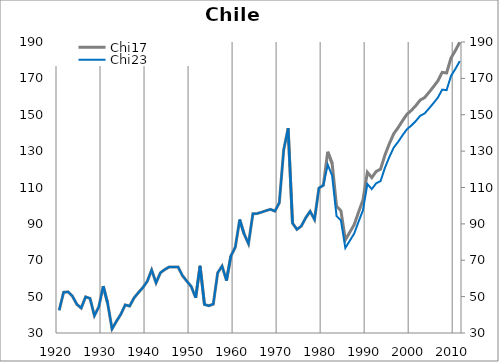
| Category | Chi17 |
|---|---|
| 1920.0 | 42.497 |
| 1921.0 | 52.365 |
| 1922.0 | 52.624 |
| 1923.0 | 50.266 |
| 1924.0 | 45.803 |
| 1925.0 | 43.705 |
| 1926.0 | 49.874 |
| 1927.0 | 49.037 |
| 1928.0 | 39.539 |
| 1929.0 | 44.392 |
| 1930.0 | 55.773 |
| 1931.0 | 46.424 |
| 1932.0 | 32.239 |
| 1933.0 | 36.43 |
| 1934.0 | 40.298 |
| 1935.0 | 45.457 |
| 1936.0 | 44.812 |
| 1937.0 | 49.28 |
| 1938.0 | 52.229 |
| 1939.0 | 54.931 |
| 1940.0 | 58.412 |
| 1941.0 | 64.652 |
| 1942.0 | 57.574 |
| 1943.0 | 63.147 |
| 1944.0 | 64.922 |
| 1945.0 | 66.32 |
| 1946.0 | 66.32 |
| 1947.0 | 66.32 |
| 1948.0 | 61.537 |
| 1949.0 | 58.457 |
| 1950.0 | 55.529 |
| 1951.0 | 49.373 |
| 1952.0 | 66.918 |
| 1953.0 | 45.662 |
| 1954.0 | 44.981 |
| 1955.0 | 45.884 |
| 1956.0 | 63.092 |
| 1957.0 | 66.782 |
| 1958.0 | 58.852 |
| 1959.0 | 72.347 |
| 1960.0 | 77.182 |
| 1961.0 | 92.318 |
| 1962.0 | 84.496 |
| 1963.0 | 79.056 |
| 1964.0 | 95.566 |
| 1965.0 | 95.738 |
| 1966.0 | 96.453 |
| 1967.0 | 97.312 |
| 1968.0 | 98.023 |
| 1969.0 | 97.007 |
| 1970.0 | 101.578 |
| 1971.0 | 130.731 |
| 1972.0 | 142.615 |
| 1973.0 | 90.404 |
| 1974.0 | 86.951 |
| 1975.0 | 88.779 |
| 1976.0 | 93.35 |
| 1977.0 | 96.905 |
| 1978.0 | 92.436 |
| 1979.0 | 109.704 |
| 1980.0 | 111.228 |
| 1981.0 | 129.625 |
| 1982.0 | 123.235 |
| 1983.0 | 99.749 |
| 1984.0 | 97.168 |
| 1985.0 | 81.209 |
| 1986.0 | 85.369 |
| 1987.0 | 89.507 |
| 1988.0 | 96.465 |
| 1989.0 | 103.105 |
| 1990.0 | 118.388 |
| 1991.0 | 115.433 |
| 1992.0 | 118.804 |
| 1993.0 | 120.098 |
| 1994.0 | 127.871 |
| 1995.0 | 134.119 |
| 1996.0 | 139.606 |
| 1997.0 | 142.959 |
| 1998.0 | 146.769 |
| 1999.0 | 150.275 |
| 2000.0 | 152.408 |
| 2001.0 | 154.999 |
| 2002.0 | 158.047 |
| 2003.0 | 159.419 |
| 2004.0 | 162.315 |
| 2005.0 | 165.363 |
| 2006.0 | 168.564 |
| 2007.0 | 173.288 |
| 2008.0 | 172.983 |
| 2009.0 | 181.213 |
| 2010.0 | 185.328 |
| 2011.0 | 189.901 |